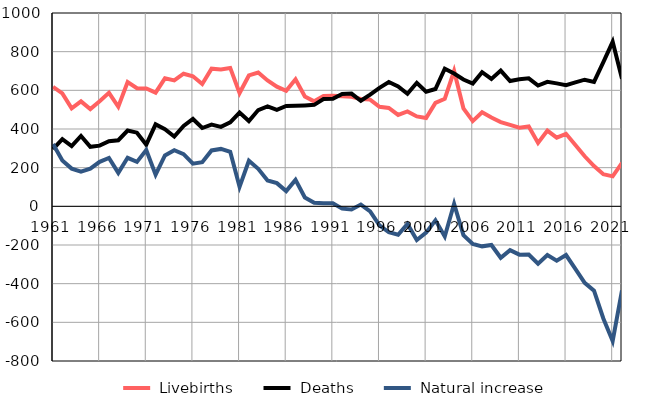
| Category |  Livebirths |  Deaths |  Natural increase |
|---|---|---|---|
| 1961.0 | 618 | 296 | 322 |
| 1962.0 | 584 | 347 | 237 |
| 1963.0 | 507 | 312 | 195 |
| 1964.0 | 543 | 364 | 179 |
| 1965.0 | 503 | 308 | 195 |
| 1966.0 | 544 | 314 | 230 |
| 1967.0 | 587 | 337 | 250 |
| 1968.0 | 515 | 342 | 173 |
| 1969.0 | 643 | 392 | 251 |
| 1970.0 | 611 | 381 | 230 |
| 1971.0 | 610 | 319 | 291 |
| 1972.0 | 588 | 424 | 164 |
| 1973.0 | 662 | 399 | 263 |
| 1974.0 | 651 | 361 | 290 |
| 1975.0 | 686 | 416 | 270 |
| 1976.0 | 673 | 452 | 221 |
| 1977.0 | 633 | 405 | 228 |
| 1978.0 | 712 | 423 | 289 |
| 1979.0 | 708 | 411 | 297 |
| 1980.0 | 716 | 434 | 282 |
| 1981.0 | 586 | 485 | 101 |
| 1982.0 | 677 | 441 | 236 |
| 1983.0 | 692 | 498 | 194 |
| 1984.0 | 651 | 517 | 134 |
| 1985.0 | 619 | 499 | 120 |
| 1986.0 | 598 | 519 | 79 |
| 1987.0 | 657 | 520 | 137 |
| 1988.0 | 568 | 522 | 46 |
| 1989.0 | 543 | 525 | 18 |
| 1990.0 | 571 | 555 | 16 |
| 1991.0 | 572 | 556 | 16 |
| 1992.0 | 569 | 581 | -12 |
| 1993.0 | 567 | 583 | -16 |
| 1994.0 | 555 | 546 | 9 |
| 1995.0 | 552 | 578 | -26 |
| 1996.0 | 515 | 613 | -98 |
| 1997.0 | 509 | 643 | -134 |
| 1998.0 | 473 | 620 | -147 |
| 1999.0 | 491 | 582 | -91 |
| 2000.0 | 465 | 639 | -174 |
| 2001.0 | 457 | 593 | -136 |
| 2002.0 | 535 | 607 | -72 |
| 2003.0 | 556 | 712 | -156 |
| 2004.0 | 700 | 687 | 13 |
| 2005.0 | 507 | 656 | -149 |
| 2006.0 | 441 | 635 | -194 |
| 2007.0 | 487 | 694 | -207 |
| 2008.0 | 459 | 659 | -200 |
| 2009.0 | 436 | 702 | -266 |
| 2010.0 | 421 | 648 | -227 |
| 2011.0 | 407 | 657 | -250 |
| 2012.0 | 413 | 662 | -249 |
| 2013.0 | 328 | 625 | -297 |
| 2014.0 | 392 | 644 | -252 |
| 2015.0 | 355 | 636 | -281 |
| 2016.0 | 375 | 627 | -252 |
| 2017.0 | 317 | 641 | -324 |
| 2018.0 | 259 | 655 | -396 |
| 2019.0 | 208 | 644 | -436 |
| 2020.0 | 166 | 746 | -580 |
| 2021.0 | 155 | 851 | -696 |
| 2022.0 | 225 | 660 | -435 |